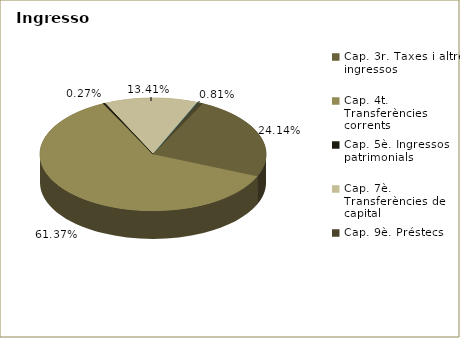
| Category | Series 0 |
|---|---|
| Cap. 3r. Taxes i altres ingressos | 82852734 |
| Cap. 4t. Transferències corrents | 210595177 |
| Cap. 5è. Ingressos patrimonials | 927638 |
| Cap. 7è. Transferències de capital | 46008273 |
| Cap. 8è. Actius financers | 0 |
| Cap. 9è. Préstecs | 2770778 |